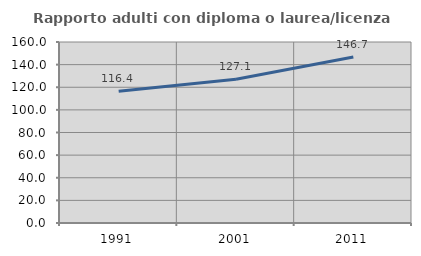
| Category | Rapporto adulti con diploma o laurea/licenza media  |
|---|---|
| 1991.0 | 116.441 |
| 2001.0 | 127.058 |
| 2011.0 | 146.742 |